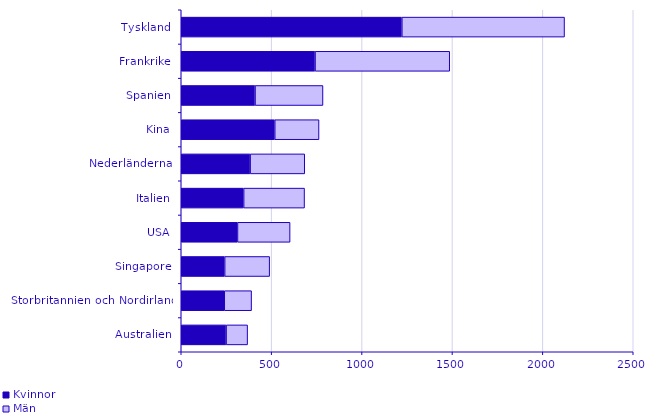
| Category | Kvinnor | Män |
|---|---|---|
| Australien | 248 | 119 |
| Storbritannien och Nordirland | 238 | 151 |
| Singapore | 240 | 249 |
| USA | 311 | 291 |
| Italien | 345 | 337 |
| Nederländerna | 381 | 302 |
| Kina | 517 | 245 |
| Spanien | 408 | 376 |
| Frankrike | 740 | 745 |
| Tyskland | 1220 | 900 |